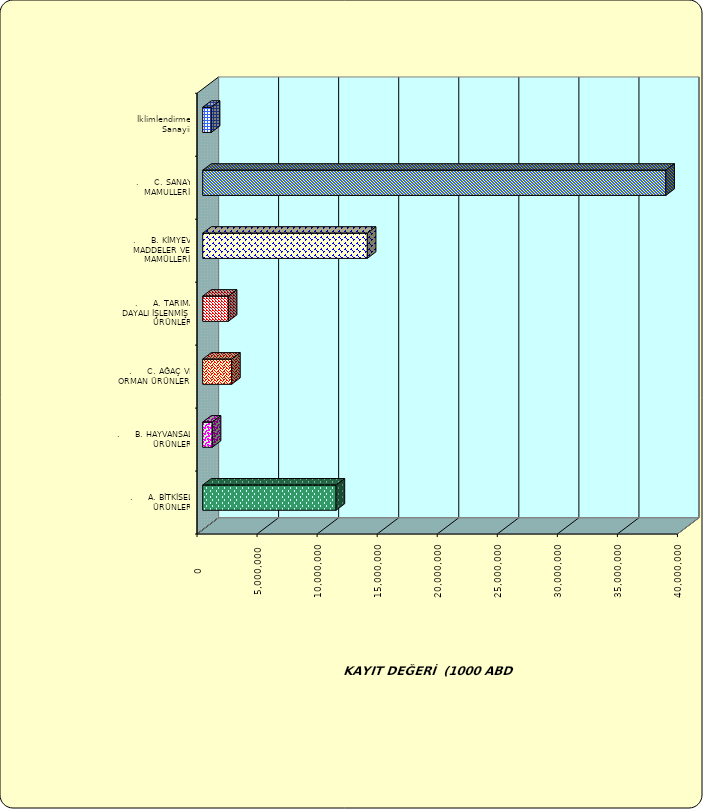
| Category | Series 0 |
|---|---|
| .     A. BİTKİSEL ÜRÜNLER | 11104333.778 |
| .     B. HAYVANSAL ÜRÜNLER | 795538.475 |
| .     C. AĞAÇ VE ORMAN ÜRÜNLERİ | 2408908.188 |
| .     A. TARIMA DAYALI İŞLENMİŞ ÜRÜNLER | 2133559.928 |
| .     B. KİMYEVİ MADDELER VE MAMÜLLERİ | 13705080.499 |
| .     C. SANAYİ MAMULLERİ | 38557495.221 |
|  İklimlendirme Sanayii | 714473.842 |